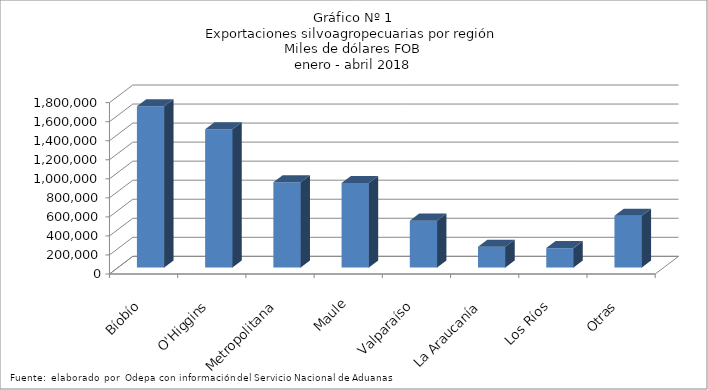
| Category | Series 0 |
|---|---|
| Bíobío | 1694882.029 |
| O'Higgins | 1452812.376 |
| Metropolitana | 895428.046 |
| Maule | 887305.405 |
| Valparaíso | 492487.53 |
| La Araucanía | 218564.499 |
| Los Ríos | 203936.304 |
| Otras | 544240.301 |